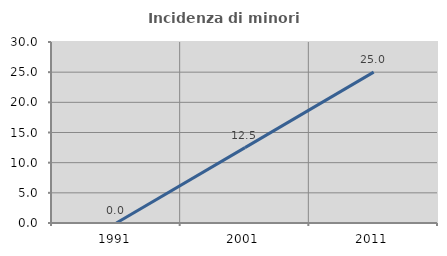
| Category | Incidenza di minori stranieri |
|---|---|
| 1991.0 | 0 |
| 2001.0 | 12.5 |
| 2011.0 | 25 |